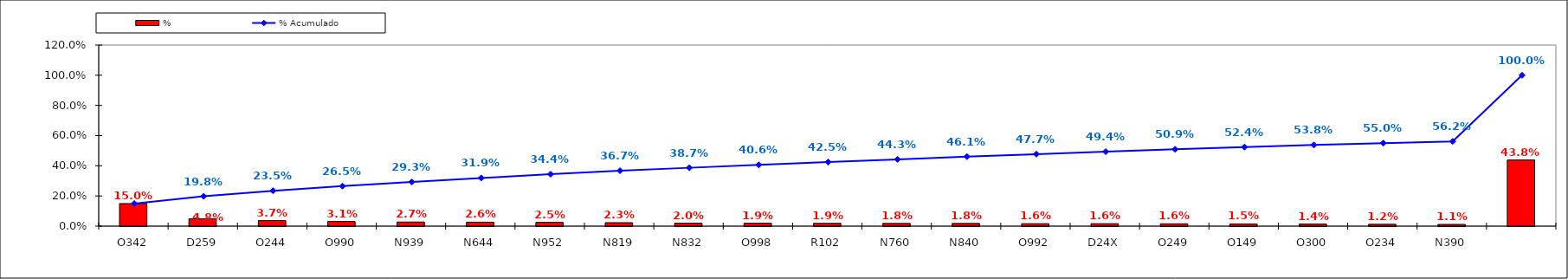
| Category | % |
|---|---|
| O342 | 0.15 |
| D259 | 0.048 |
| O244 | 0.037 |
| O990 | 0.031 |
| N939 | 0.027 |
| N644 | 0.026 |
| N952 | 0.025 |
| N819 | 0.023 |
| N832 | 0.02 |
| O998 | 0.019 |
| R102 | 0.019 |
| N760 | 0.018 |
| N840 | 0.018 |
| O992 | 0.016 |
| D24X | 0.016 |
| O249 | 0.016 |
| O149 | 0.015 |
| O300 | 0.014 |
| O234 | 0.012 |
| N390 | 0.011 |